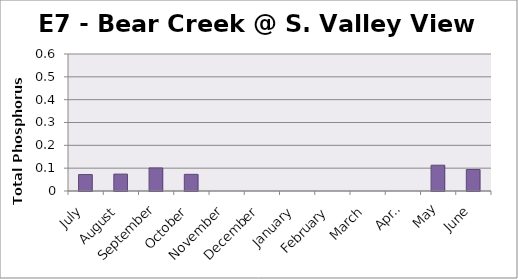
| Category | Phosphorus (mg/L) |
|---|---|
| July | 0.072 |
| August | 0.074 |
| September | 0.101 |
| October | 0.073 |
| November | 0 |
| December | 0 |
| January | 0 |
| February | 0 |
| March | 0 |
| April | 0 |
| May | 0.113 |
| June | 0.094 |